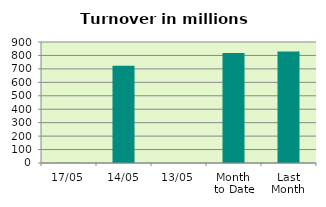
| Category | Series 0 |
|---|---|
| 17/05 | 0.412 |
| 14/05 | 723.312 |
| 13/05 | 0 |
| Month 
to Date | 818.145 |
| Last
Month | 829.993 |